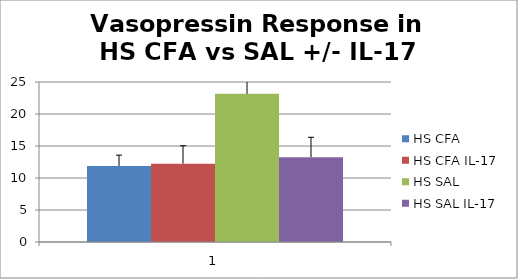
| Category | HS CFA | HS CFA IL-17 | HS SAL | HS SAL IL-17 |
|---|---|---|---|---|
| 0 | 11.873 | 12.238 | 23.15 | 13.26 |